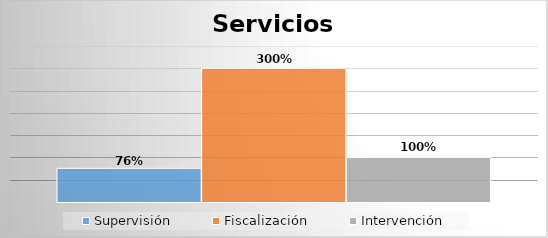
| Category | Supervisión | Fiscalización | Intervención |
|---|---|---|---|
| 0 | 0.755 | 3 | 1 |